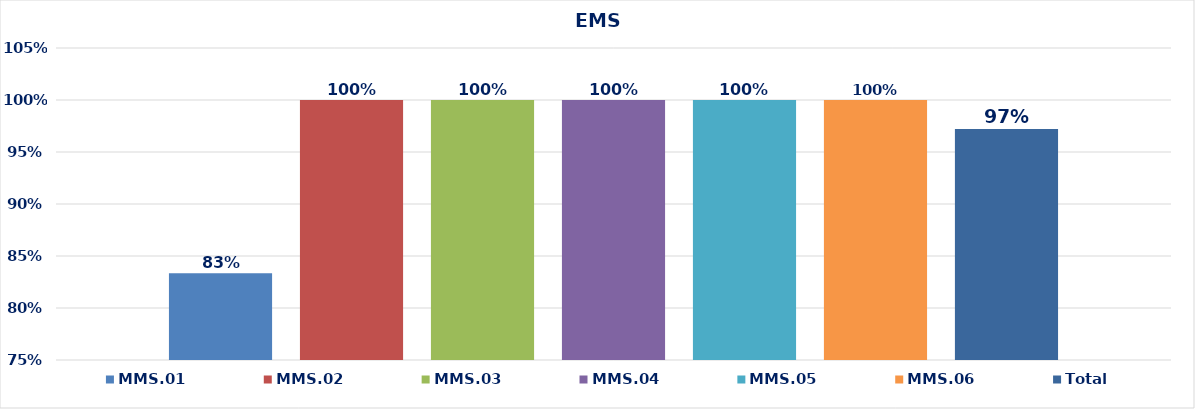
| Category | MMS.01 | MMS.02 | MMS.03 | MMS.04 | MMS.05 | MMS.06 | Total |
|---|---|---|---|---|---|---|---|
| 0 | 0.833 | 1 | 1 | 1 | 1 | 1 | 0.972 |